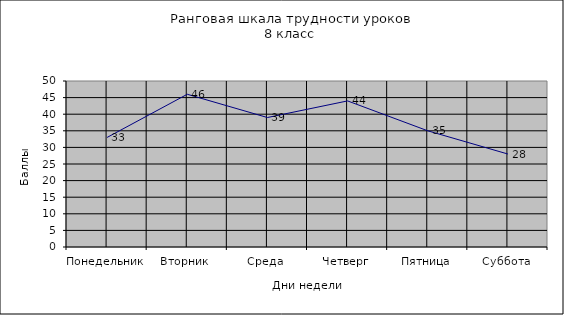
| Category | Series 0 |
|---|---|
| Понедельник | 33 |
| Вторник | 46 |
| Среда | 39 |
| Четверг | 44 |
| Пятница | 35 |
| Суббота | 28 |